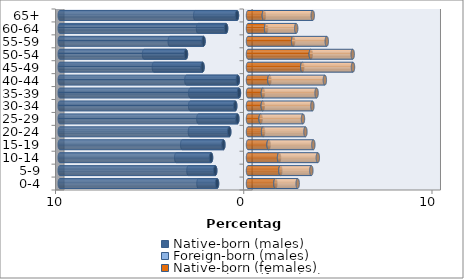
| Category | Native-born (males) | Foreign-born (males) | Native-born (females) | Foreign-born (females) |
|---|---|---|---|---|
| 0-4 | -1.645 | -0.986 | 1.457 | 1.183 |
| 5-9 | -1.742 | -1.421 | 1.72 | 1.645 |
| 10-14 | -1.963 | -1.85 | 1.649 | 2.06 |
| 15-19 | -1.309 | -2.186 | 1.094 | 2.376 |
| 20-24 | -0.997 | -2.089 | 0.8 | 2.25 |
| 25-29 | -0.566 | -2.069 | 0.67 | 2.25 |
| 30-34 | -0.679 | -2.394 | 0.785 | 2.635 |
| 35-39 | -0.482 | -2.586 | 0.791 | 2.852 |
| 40-44 | -0.542 | -2.732 | 1.136 | 2.947 |
| 45-49 | -2.416 | -2.584 | 2.883 | 2.695 |
| 50-54 | -3.296 | -2.226 | 3.336 | 2.226 |
| 55-59 | -2.363 | -1.795 | 2.396 | 1.788 |
| 60-64 | -1.165 | -1.49 | 0.959 | 1.6 |
| 65+ | -0.586 | -2.217 | 0.842 | 2.597 |